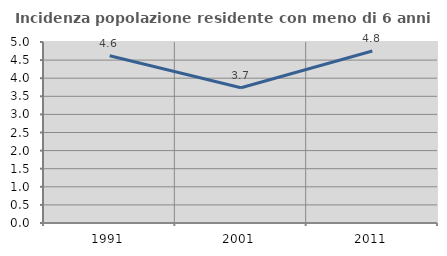
| Category | Incidenza popolazione residente con meno di 6 anni |
|---|---|
| 1991.0 | 4.619 |
| 2001.0 | 3.737 |
| 2011.0 | 4.751 |